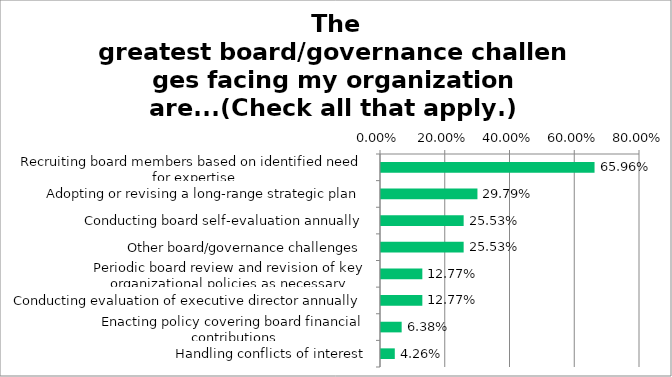
| Category | Responses |
|---|---|
| Recruiting board members based on identified need for expertise | 0.66 |
| Adopting or revising a long-range strategic plan | 0.298 |
| Conducting board self-evaluation annually | 0.255 |
| Other board/governance challenges | 0.255 |
| Periodic board review and revision of key organizational policies as necessary | 0.128 |
| Conducting evaluation of executive director annually | 0.128 |
| Enacting policy covering board financial contributions | 0.064 |
| Handling conflicts of interest | 0.043 |